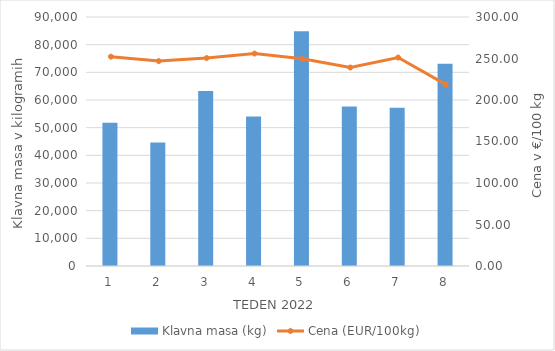
| Category | Klavna masa (kg) |
|---|---|
| 1.0 | 51818 |
| 2.0 | 44619 |
| 3.0 | 63233 |
| 4.0 | 53993 |
| 5.0 | 84871 |
| 6.0 | 57648 |
| 7.0 | 57159 |
| 8.0 | 73139 |